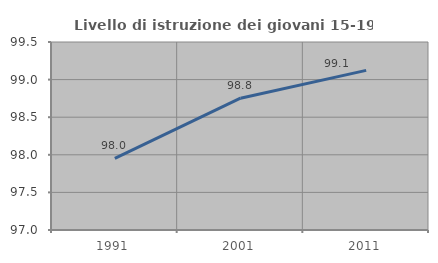
| Category | Livello di istruzione dei giovani 15-19 anni |
|---|---|
| 1991.0 | 97.952 |
| 2001.0 | 98.753 |
| 2011.0 | 99.123 |